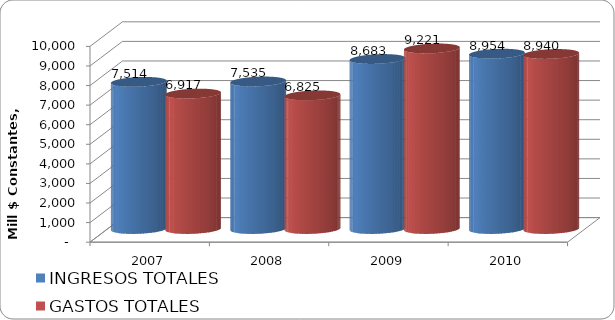
| Category | INGRESOS TOTALES | GASTOS TOTALES |
|---|---|---|
| 2007 | 7514.374 | 6917.258 |
| 2008 | 7534.711 | 6825.438 |
| 2009 | 8682.787 | 9221.335 |
| 2010 | 8954 | 8940 |